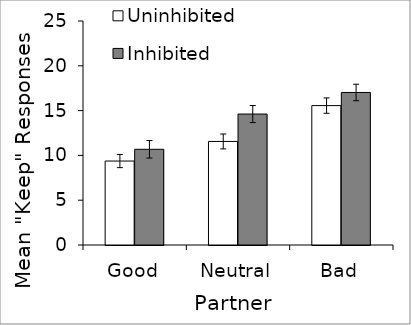
| Category | Uninhibited | Inhibited |
|---|---|---|
| Good | 9.371 | 10.682 |
| Neutral | 11.557 | 14.614 |
| Bad | 15.557 | 17.023 |